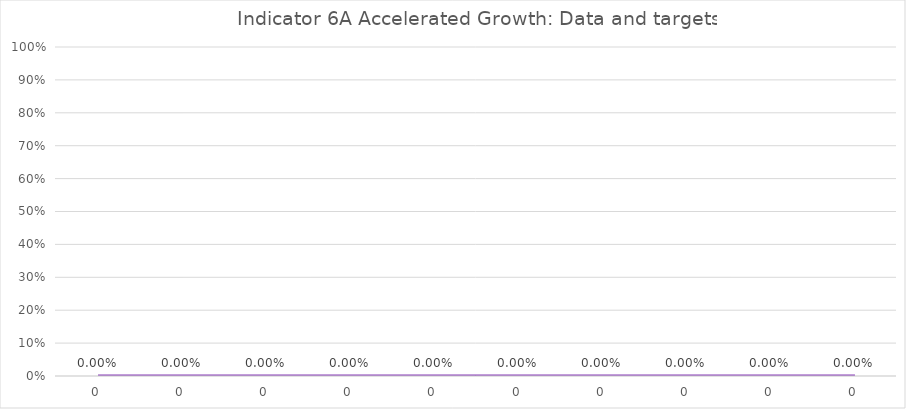
| Category | Indicator 6A data 
and targets |
|---|---|
| 0.0 | 0 |
| 0.0 | 0 |
| 0.0 | 0 |
| 0.0 | 0 |
| 0.0 | 0 |
| 0.0 | 0 |
| 0.0 | 0 |
| 0.0 | 0 |
| 0.0 | 0 |
| 0.0 | 0 |